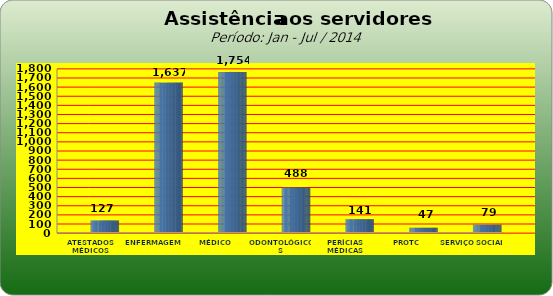
| Category | Series 0 |
|---|---|
| ATESTADOS MÉDICOS | 127 |
| ENFERMAGEM | 1637 |
| MÉDICO | 1754 |
| ODONTOLÓGICOS | 488 |
| PERÍCIAS MÉDICAS | 141 |
| PROTC | 47 |
| SERVIÇO SOCIAL | 79 |